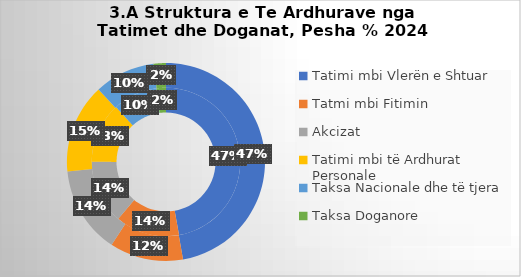
| Category | 2023* | 2024* |
|---|---|---|
| Tatimi mbi Vlerën e Shtuar | 200 | 211.2 |
| Tatmi mbi Fitimin | 59 | 53.68 |
| Akcizat | 59 | 63.6 |
| Tatimi mbi të Ardhurat Personale | 56 | 65.2 |
| Taksa Nacionale dhe të tjera | 41 | 44.292 |
| Taksa Doganore | 8.8 | 9.02 |